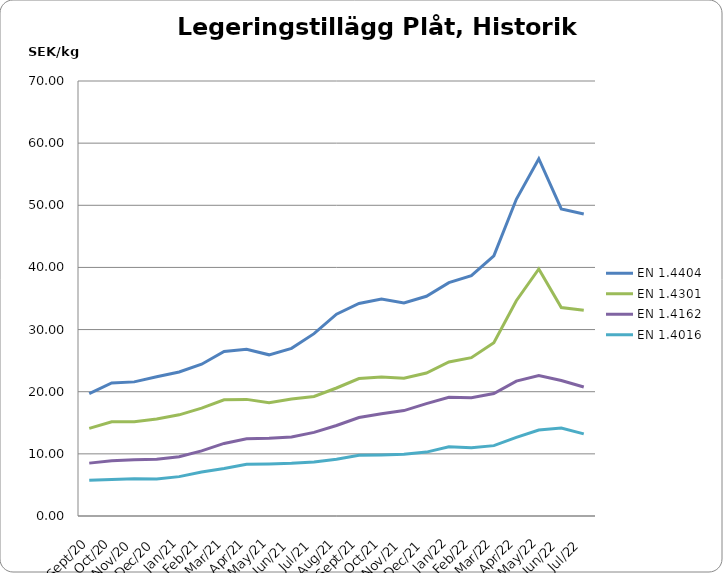
| Category | EN 1.4404 | EN 1.4301 | EN 1.4162  | EN 1.4016 |
|---|---|---|---|---|
| 2020-09-01 | 19.682 | 14.092 | 8.509 | 5.737 |
| 2020-10-01 | 21.4 | 15.147 | 8.892 | 5.888 |
| 2020-11-01 | 21.582 | 15.177 | 9.062 | 6.011 |
| 2020-12-01 | 22.402 | 15.617 | 9.115 | 5.945 |
| 2021-01-01 | 23.183 | 16.279 | 9.524 | 6.334 |
| 2021-02-01 | 24.425 | 17.354 | 10.488 | 7.077 |
| 2021-03-01 | 26.469 | 18.69 | 11.679 | 7.656 |
| 2021-04-01 | 26.842 | 18.766 | 12.443 | 8.336 |
| 2021-05-01 | 25.936 | 18.21 | 12.499 | 8.373 |
| 2021-06-01 | 26.983 | 18.811 | 12.71 | 8.473 |
| 2021-07-01 | 29.342 | 19.226 | 13.458 | 8.692 |
| 2021-08-01 | 32.47 | 20.6 | 14.57 | 9.13 |
| 2021-09-01 | 34.198 | 22.11 | 15.843 | 9.772 |
| 2021-10-01 | 34.921 | 22.349 | 16.463 | 9.835 |
| 2021-11-01 | 34.269 | 22.154 | 16.96 | 9.932 |
| 2021-12-01 | 35.354 | 23.005 | 18.083 | 10.283 |
| 2022-01-01 | 37.55 | 24.78 | 19.09 | 11.13 |
| 2022-02-01 | 38.671 | 25.483 | 19.037 | 10.978 |
| 2022-03-01 | 41.871 | 27.88 | 19.71 | 11.325 |
| 2022-04-01 | 50.965 | 34.648 | 21.714 | 12.643 |
| 2022-05-01 | 57.492 | 39.761 | 22.591 | 13.846 |
| 2022-06-01 | 49.411 | 33.552 | 21.813 | 14.158 |
| 2022-07-01 | 48.608 | 33.118 | 20.769 | 13.21 |